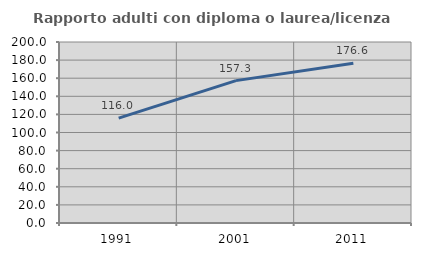
| Category | Rapporto adulti con diploma o laurea/licenza media  |
|---|---|
| 1991.0 | 115.951 |
| 2001.0 | 157.31 |
| 2011.0 | 176.596 |